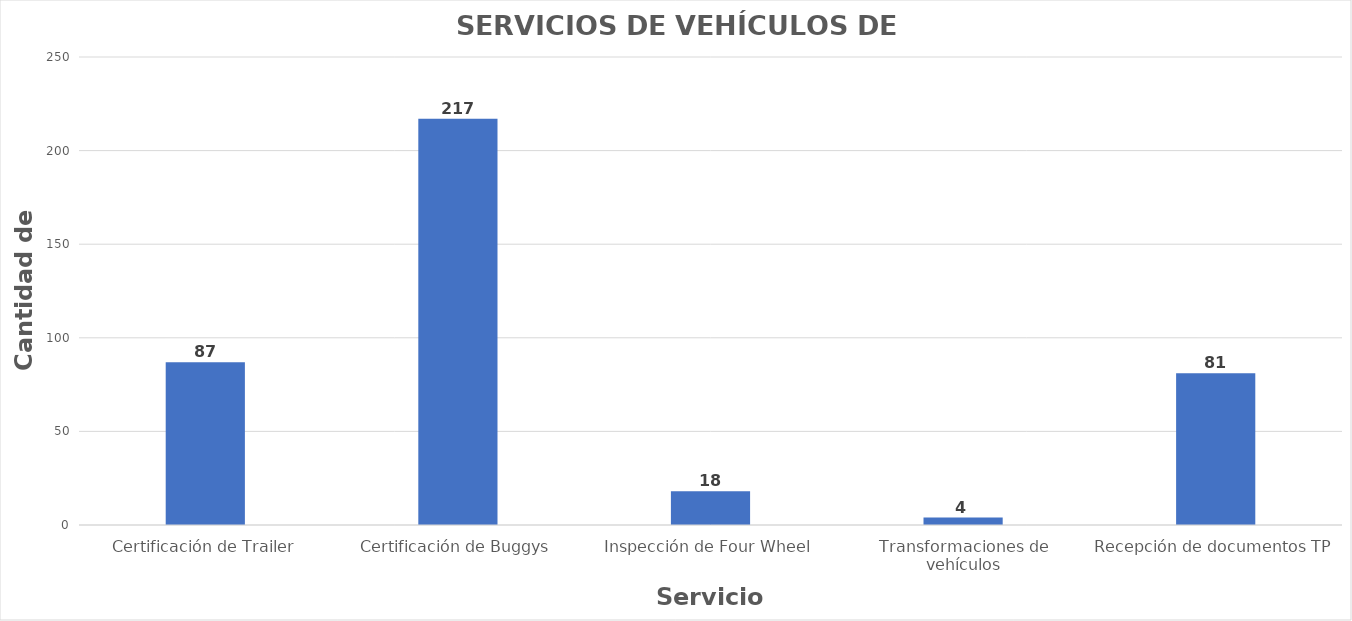
| Category | Series 0 |
|---|---|
| Certificación de Trailer | 87 |
| Certificación de Buggys | 217 |
| Inspección de Four Wheel | 18 |
| Transformaciones de vehículos | 4 |
| Recepción de documentos TP | 81 |